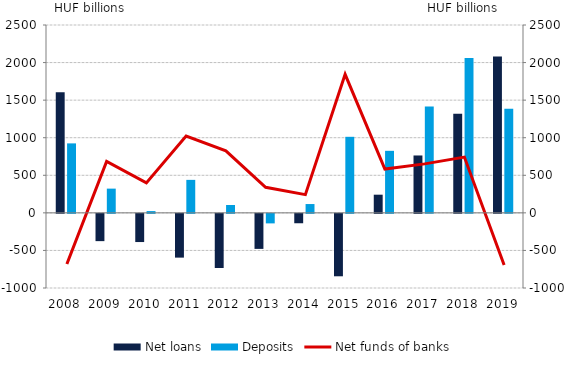
| Category | Net loans | Deposits |
|---|---|---|
| 2008.0 | 1604.117 | 924.526 |
| 2009.0 | -363.024 | 322.449 |
| 2010.0 | -375.15 | 23.517 |
| 2011.0 | -582.414 | 439.017 |
| 2012.0 | -720.502 | 104.961 |
| 2013.0 | -466.305 | -126.817 |
| 2014.0 | -125.073 | 117.279 |
| 2015.0 | -830.803 | 1012.037 |
| 2016.0 | 241.811 | 825.492 |
| 2017.0 | 763.636 | 1415.416 |
| 2018.0 | 1320.258 | 2062.239 |
| 2019.0 | 2080.908 | 1385.68 |